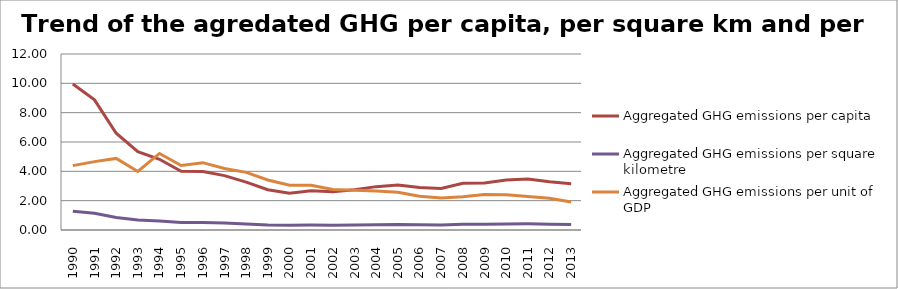
| Category | Aggregated GHG emissions per capita                                                                                                           | Aggregated GHG emissions per square kilometre                                                                           | Aggregated GHG emissions per unit of GDP                                                                                                   |
|---|---|---|---|
| 1990.0 | 9.955 | 1.286 | 4.389 |
| 1991.0 | 8.874 | 1.148 | 4.662 |
| 1992.0 | 6.596 | 0.852 | 4.88 |
| 1993.0 | 5.34 | 0.686 | 3.988 |
| 1994.0 | 4.823 | 0.62 | 5.218 |
| 1995.0 | 4.007 | 0.515 | 4.393 |
| 1996.0 | 3.983 | 0.51 | 4.591 |
| 1997.0 | 3.71 | 0.473 | 4.195 |
| 1998.0 | 3.263 | 0.415 | 3.932 |
| 1999.0 | 2.742 | 0.348 | 3.412 |
| 2000.0 | 2.506 | 0.317 | 3.046 |
| 2001.0 | 2.67 | 0.337 | 3.056 |
| 2002.0 | 2.615 | 0.329 | 2.765 |
| 2003.0 | 2.739 | 0.343 | 2.705 |
| 2004.0 | 2.957 | 0.364 | 2.667 |
| 2005.0 | 3.075 | 0.377 | 2.571 |
| 2006.0 | 2.891 | 0.353 | 2.298 |
| 2007.0 | 2.833 | 0.344 | 2.177 |
| 2008.0 | 3.185 | 0.386 | 2.262 |
| 2009.0 | 3.212 | 0.388 | 2.421 |
| 2010.0 | 3.415 | 0.412 | 2.399 |
| 2011.0 | 3.471 | 0.418 | 2.278 |
| 2012.0 | 3.284 | 0.395 | 2.168 |
| 2013.0 | 3.158 | 0.379 | 1.912 |